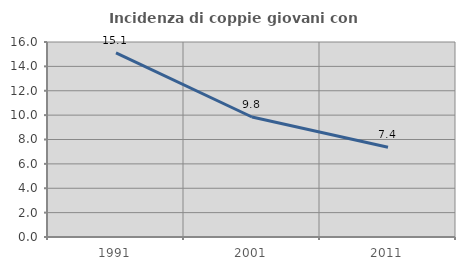
| Category | Incidenza di coppie giovani con figli |
|---|---|
| 1991.0 | 15.111 |
| 2001.0 | 9.846 |
| 2011.0 | 7.36 |